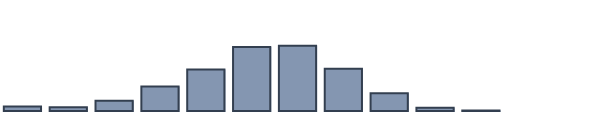
| Category | Series 0 |
|---|---|
| 0 | 1.667 |
| 1 | 1.364 |
| 2 | 3.712 |
| 3 | 8.788 |
| 4 | 14.924 |
| 5 | 23.106 |
| 6 | 23.485 |
| 7 | 15.227 |
| 8 | 6.364 |
| 9 | 1.212 |
| 10 | 0.152 |
| 11 | 0 |
| 12 | 0 |